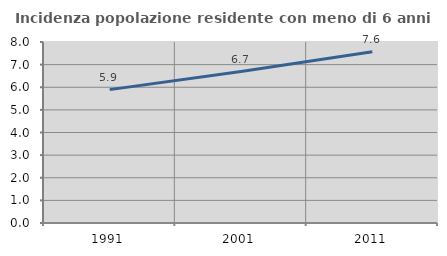
| Category | Incidenza popolazione residente con meno di 6 anni |
|---|---|
| 1991.0 | 5.894 |
| 2001.0 | 6.696 |
| 2011.0 | 7.572 |